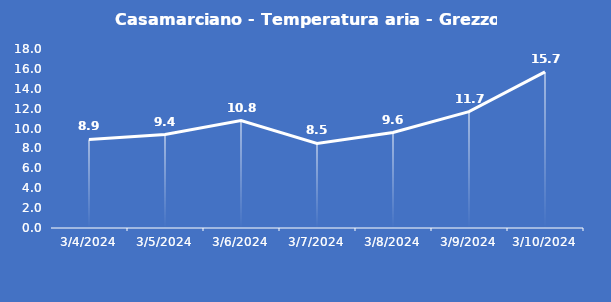
| Category | Casamarciano - Temperatura aria - Grezzo (°C) |
|---|---|
| 3/4/24 | 8.9 |
| 3/5/24 | 9.4 |
| 3/6/24 | 10.8 |
| 3/7/24 | 8.5 |
| 3/8/24 | 9.6 |
| 3/9/24 | 11.7 |
| 3/10/24 | 15.7 |